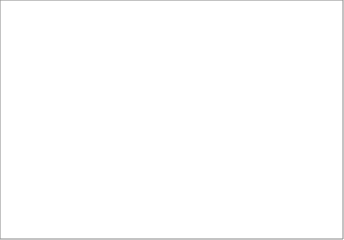
| Category | Series 0 |
|---|---|
| red | 20 |
| blue | 10 |
| yellow | 40 |
| green  | 10 |